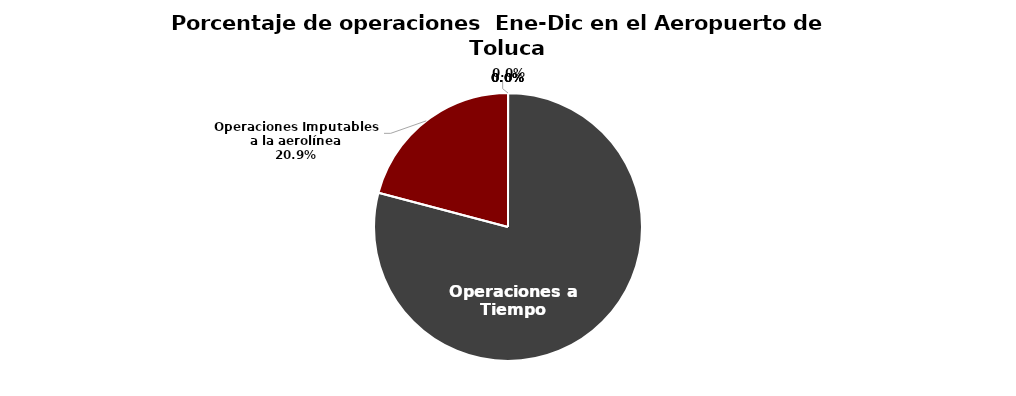
| Category | Series 0 |
|---|---|
| Operaciones a Tiempo | 8199 |
| Operaciones Imputables a la aerolínea | 2164 |